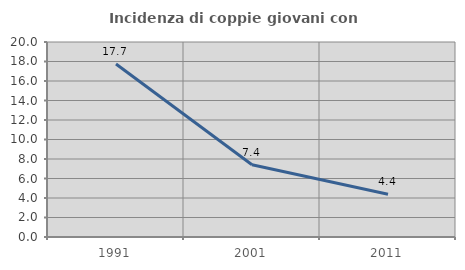
| Category | Incidenza di coppie giovani con figli |
|---|---|
| 1991.0 | 17.742 |
| 2001.0 | 7.407 |
| 2011.0 | 4.386 |